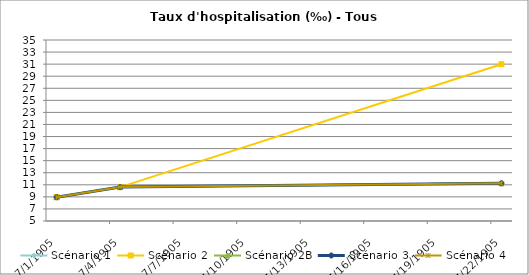
| Category | Scénario 1 | Scénario 2 | Scénario 2B | Scénario 3 | Scénario 4 |
|---|---|---|---|---|---|
| 2009.0 | 8.945 | 8.945 | 8.945 | 8.945 | 8.945 |
| 2012.0 | 10.616 | 10.616 | 10.616 | 10.616 | 10.616 |
| 2030.0 | 11.251 | 30.99 | 11.251 | 11.251 | 11.251 |